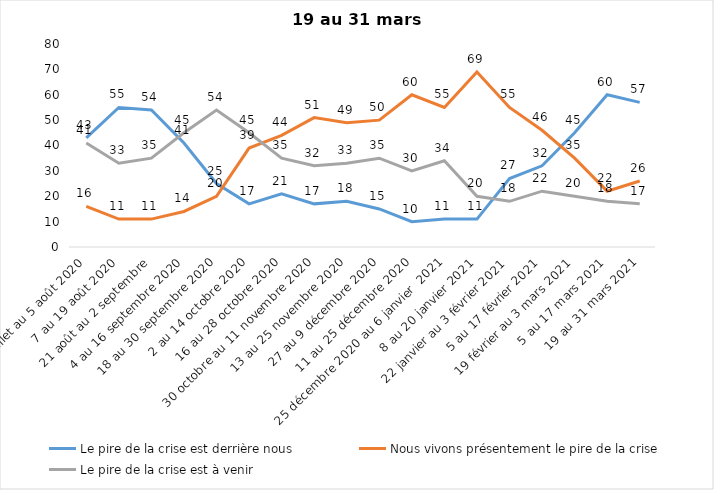
| Category | Le pire de la crise est derrière nous | Nous vivons présentement le pire de la crise | Le pire de la crise est à venir |
|---|---|---|---|
| 24 juillet au 5 août 2020 | 43 | 16 | 41 |
| 7 au 19 août 2020 | 55 | 11 | 33 |
| 21 août au 2 septembre | 54 | 11 | 35 |
| 4 au 16 septembre 2020 | 41 | 14 | 45 |
| 18 au 30 septembre 2020 | 25 | 20 | 54 |
| 2 au 14 octobre 2020 | 17 | 39 | 45 |
| 16 au 28 octobre 2020 | 21 | 44 | 35 |
| 30 octobre au 11 novembre 2020 | 17 | 51 | 32 |
| 13 au 25 novembre 2020 | 18 | 49 | 33 |
| 27 au 9 décembre 2020 | 15 | 50 | 35 |
| 11 au 25 décembre 2020 | 10 | 60 | 30 |
| 25 décembre 2020 au 6 janvier  2021 | 11 | 55 | 34 |
| 8 au 20 janvier 2021 | 11 | 69 | 20 |
| 22 janvier au 3 février 2021 | 27 | 55 | 18 |
| 5 au 17 février 2021 | 32 | 46 | 22 |
| 19 février au 3 mars 2021 | 45 | 35 | 20 |
| 5 au 17 mars 2021 | 60 | 22 | 18 |
| 19 au 31 mars 2021 | 57 | 26 | 17 |